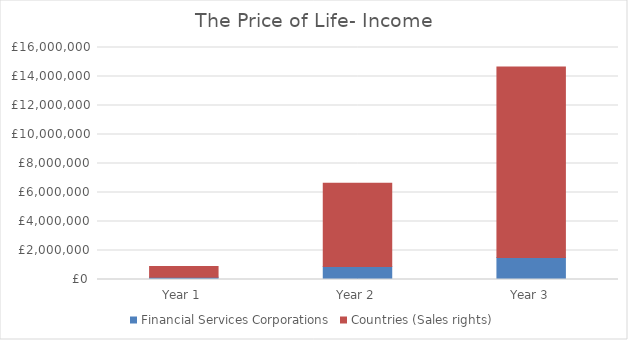
| Category | Financial Services Corporations | Countries (Sales rights) |
|---|---|---|
| Year 1 | 150000 | 752000 |
| Year 2 | 900000 | 5736000 |
| Year 3 | 1520000 | 13128000 |